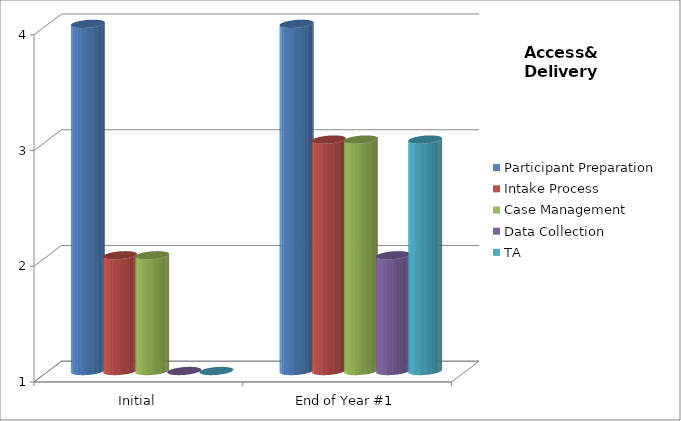
| Category | Participant Preparation  | Intake Process  | Case Management  | Data Collection  | TA |
|---|---|---|---|---|---|
| Initial | 4 | 2 | 2 | 1 | 1 |
| End of Year #1 | 4 | 3 | 3 | 2 | 3 |